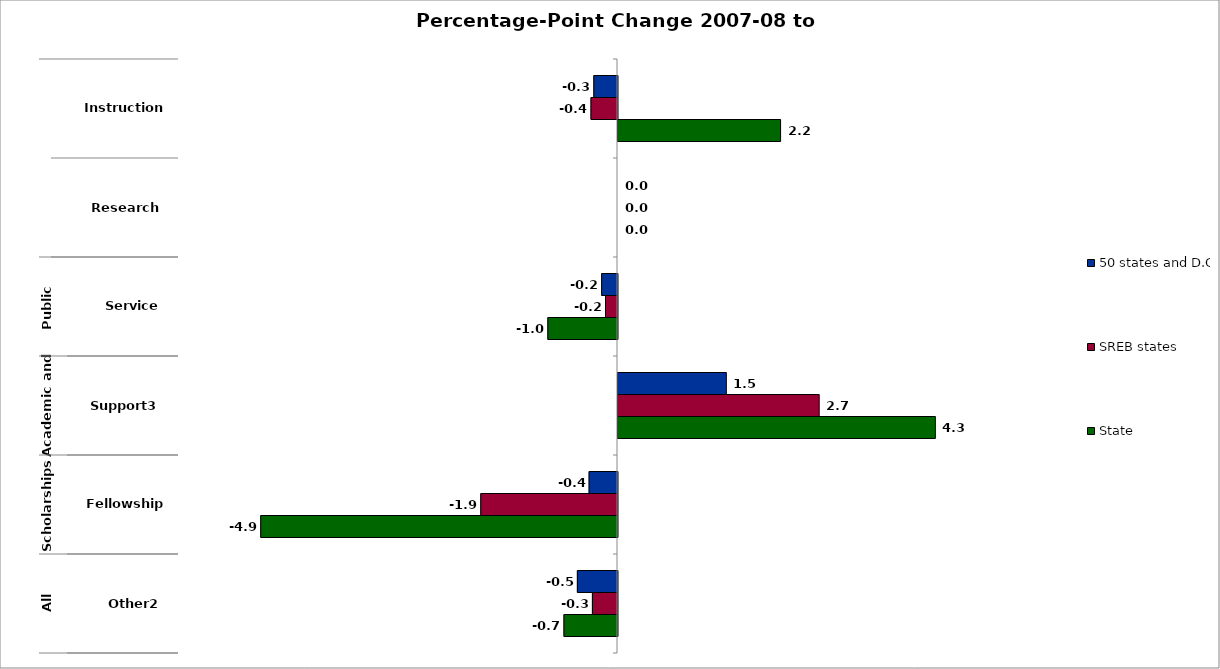
| Category | 50 states and D.C. | SREB states | State |
|---|---|---|---|
| 0 | -0.324 | -0.362 | 2.222 |
| 1 | 0 | 0 | 0 |
| 2 | -0.217 | -0.164 | -0.952 |
| 3 | 1.481 | 2.75 | 4.338 |
| 4 | -0.388 | -1.868 | -4.876 |
| 5 | -0.548 | -0.343 | -0.732 |